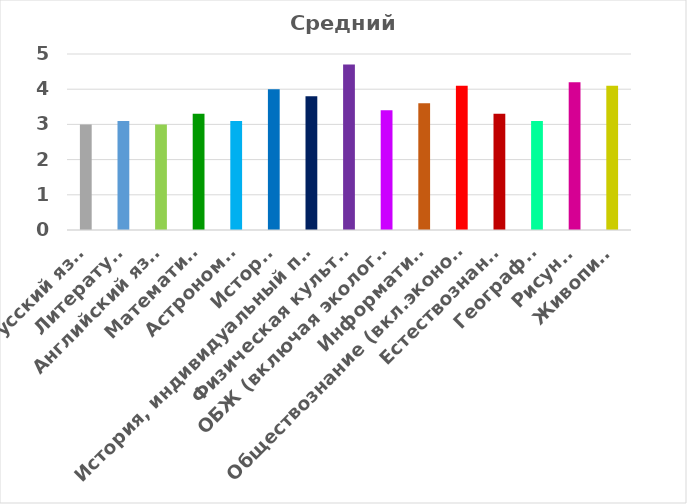
| Category | Средний балл |
|---|---|
| Русский язык | 3 |
| Литература | 3.1 |
| Английский язык | 3 |
| Математика | 3.3 |
| Астрономия | 3.1 |
| История | 4 |
| История, индивидуальный проект | 3.8 |
| Физическая культура | 4.7 |
| ОБЖ (включая экологию) | 3.4 |
| Информатика | 3.6 |
| Обществознание (вкл.экономику и право) | 4.1 |
| Естествознание | 3.3 |
| География | 3.1 |
| Рисунок | 4.2 |
| Живопись | 4.1 |